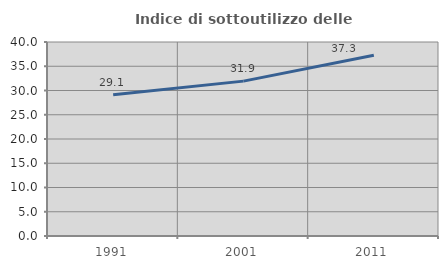
| Category | Indice di sottoutilizzo delle abitazioni  |
|---|---|
| 1991.0 | 29.142 |
| 2001.0 | 31.933 |
| 2011.0 | 37.254 |